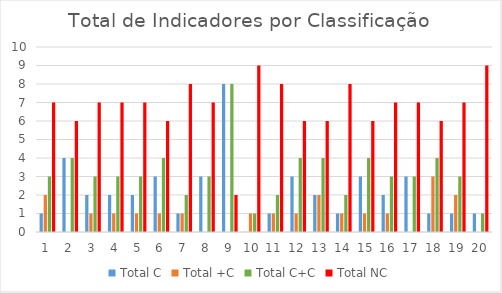
| Category | Total C | Total +C | Total C+C | Total NC |
|---|---|---|---|---|
| 0 | 1 | 2 | 3 | 7 |
| 1 | 4 | 0 | 4 | 6 |
| 2 | 2 | 1 | 3 | 7 |
| 3 | 2 | 1 | 3 | 7 |
| 4 | 2 | 1 | 3 | 7 |
| 5 | 3 | 1 | 4 | 6 |
| 6 | 1 | 1 | 2 | 8 |
| 7 | 3 | 0 | 3 | 7 |
| 8 | 8 | 0 | 8 | 2 |
| 9 | 0 | 1 | 1 | 9 |
| 10 | 1 | 1 | 2 | 8 |
| 11 | 3 | 1 | 4 | 6 |
| 12 | 2 | 2 | 4 | 6 |
| 13 | 1 | 1 | 2 | 8 |
| 14 | 3 | 1 | 4 | 6 |
| 15 | 2 | 1 | 3 | 7 |
| 16 | 3 | 0 | 3 | 7 |
| 17 | 1 | 3 | 4 | 6 |
| 18 | 1 | 2 | 3 | 7 |
| 19 | 1 | 0 | 1 | 9 |